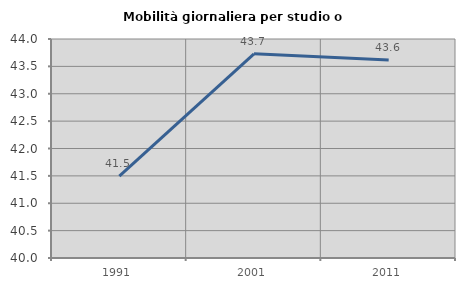
| Category | Mobilità giornaliera per studio o lavoro |
|---|---|
| 1991.0 | 41.495 |
| 2001.0 | 43.73 |
| 2011.0 | 43.617 |